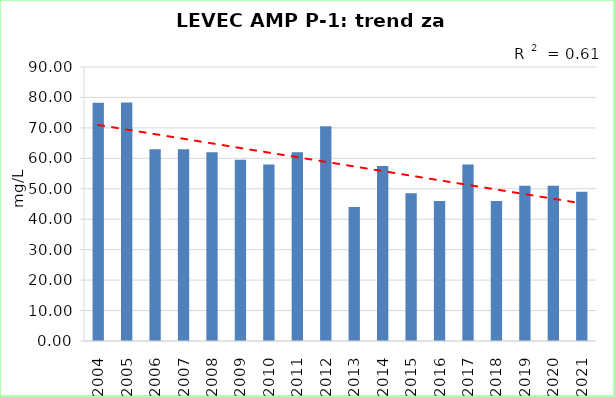
| Category | Vsota |
|---|---|
| 2004 | 78.233 |
| 2005 | 78.367 |
| 2006 | 63 |
| 2007 | 63 |
| 2008 | 62 |
| 2009 | 59.5 |
| 2010 | 58 |
| 2011 | 62 |
| 2012 | 70.5 |
| 2013 | 44 |
| 2014 | 57.5 |
| 2015 | 48.5 |
| 2016 | 46 |
| 2017 | 58 |
| 2018 | 46 |
| 2019 | 51 |
| 2020 | 51 |
| 2021 | 49 |